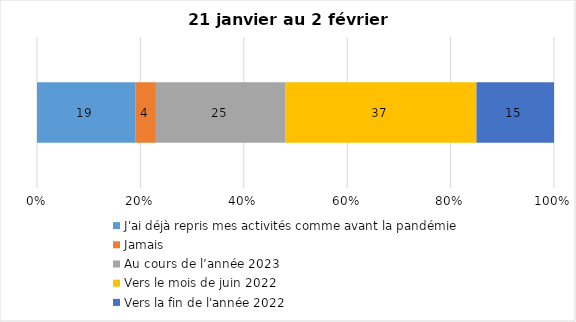
| Category | J'ai déjà repris mes activités comme avant la pandémie | Jamais | Au cours de l’année 2023 | Vers le mois de juin 2022 | Vers la fin de l'année 2022 |
|---|---|---|---|---|---|
| 0 | 19 | 4 | 25 | 37 | 15 |